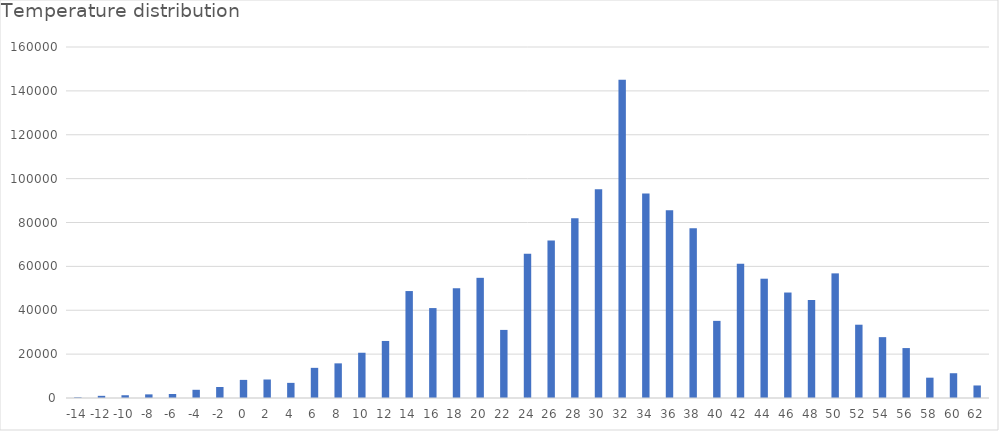
| Category | Series 0 |
|---|---|
| -14.0 | 312 |
| -12.0 | 988 |
| -10.0 | 1258 |
| -8.0 | 1656 |
| -6.0 | 1820 |
| -4.0 | 3740 |
| -2.0 | 5016 |
| 0.0 | 8256 |
| 2.0 | 8432 |
| 4.0 | 6900 |
| 6.0 | 13746 |
| 8.0 | 15792 |
| 10.0 | 20628 |
| 12.0 | 26000 |
| 14.0 | 48750 |
| 16.0 | 40992 |
| 18.0 | 50002 |
| 20.0 | 54780 |
| 22.0 | 31038 |
| 24.0 | 65800 |
| 26.0 | 71820 |
| 28.0 | 81936 |
| 30.0 | 95132 |
| 32.0 | 145088 |
| 34.0 | 93240 |
| 36.0 | 85540 |
| 38.0 | 77376 |
| 40.0 | 35160 |
| 42.0 | 61160 |
| 44.0 | 54380 |
| 46.0 | 48078 |
| 48.0 | 44704 |
| 50.0 | 56812 |
| 52.0 | 33408 |
| 54.0 | 27740 |
| 56.0 | 22760 |
| 58.0 | 9264 |
| 60.0 | 11292 |
| 62.0 | 5712 |